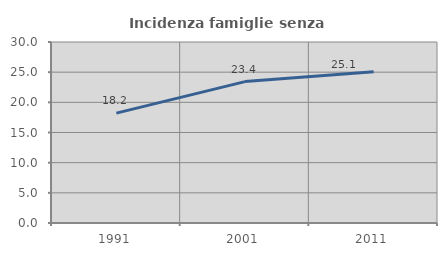
| Category | Incidenza famiglie senza nuclei |
|---|---|
| 1991.0 | 18.216 |
| 2001.0 | 23.438 |
| 2011.0 | 25.074 |